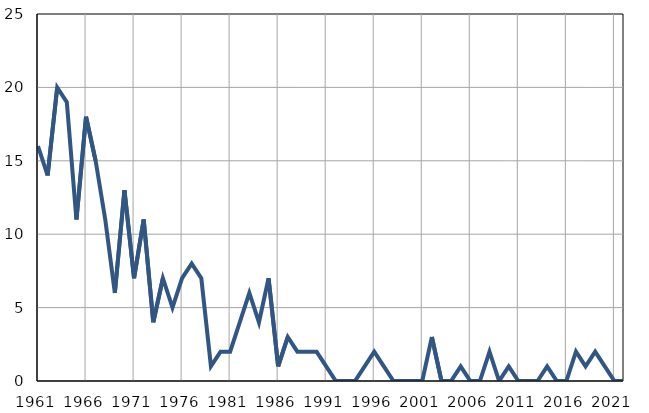
| Category | Infants
deaths |
|---|---|
| 1961.0 | 16 |
| 1962.0 | 14 |
| 1963.0 | 20 |
| 1964.0 | 19 |
| 1965.0 | 11 |
| 1966.0 | 18 |
| 1967.0 | 15 |
| 1968.0 | 11 |
| 1969.0 | 6 |
| 1970.0 | 13 |
| 1971.0 | 7 |
| 1972.0 | 11 |
| 1973.0 | 4 |
| 1974.0 | 7 |
| 1975.0 | 5 |
| 1976.0 | 7 |
| 1977.0 | 8 |
| 1978.0 | 7 |
| 1979.0 | 1 |
| 1980.0 | 2 |
| 1981.0 | 2 |
| 1982.0 | 4 |
| 1983.0 | 6 |
| 1984.0 | 4 |
| 1985.0 | 7 |
| 1986.0 | 1 |
| 1987.0 | 3 |
| 1988.0 | 2 |
| 1989.0 | 2 |
| 1990.0 | 2 |
| 1991.0 | 1 |
| 1992.0 | 0 |
| 1993.0 | 0 |
| 1994.0 | 0 |
| 1995.0 | 1 |
| 1996.0 | 2 |
| 1997.0 | 1 |
| 1998.0 | 0 |
| 1999.0 | 0 |
| 2000.0 | 0 |
| 2001.0 | 0 |
| 2002.0 | 3 |
| 2003.0 | 0 |
| 2004.0 | 0 |
| 2005.0 | 1 |
| 2006.0 | 0 |
| 2007.0 | 0 |
| 2008.0 | 2 |
| 2009.0 | 0 |
| 2010.0 | 1 |
| 2011.0 | 0 |
| 2012.0 | 0 |
| 2013.0 | 0 |
| 2014.0 | 1 |
| 2015.0 | 0 |
| 2016.0 | 0 |
| 2017.0 | 2 |
| 2018.0 | 1 |
| 2019.0 | 2 |
| 2020.0 | 1 |
| 2021.0 | 0 |
| 2022.0 | 0 |